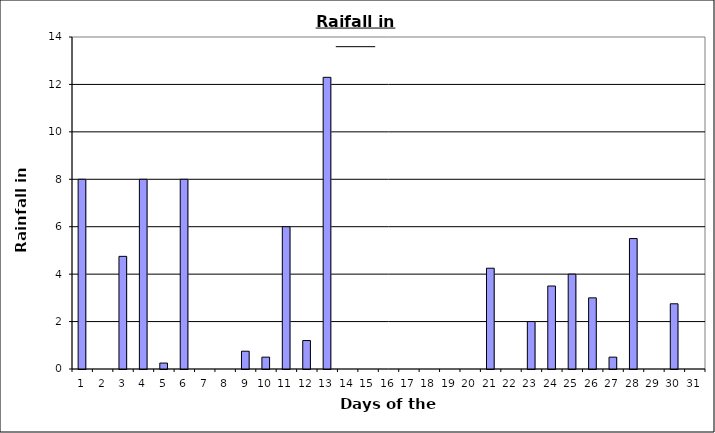
| Category | Series 0 |
|---|---|
| 0 | 8 |
| 1 | 0 |
| 2 | 4.75 |
| 3 | 8 |
| 4 | 0.25 |
| 5 | 8 |
| 6 | 0 |
| 7 | 0 |
| 8 | 0.75 |
| 9 | 0.5 |
| 10 | 6 |
| 11 | 1.2 |
| 12 | 12.3 |
| 13 | 0 |
| 14 | 0 |
| 15 | 0 |
| 16 | 0 |
| 17 | 0 |
| 18 | 0 |
| 19 | 0 |
| 20 | 4.25 |
| 21 | 0 |
| 22 | 2 |
| 23 | 3.5 |
| 24 | 4 |
| 25 | 3 |
| 26 | 0.5 |
| 27 | 5.5 |
| 28 | 0 |
| 29 | 2.75 |
| 30 | 0 |